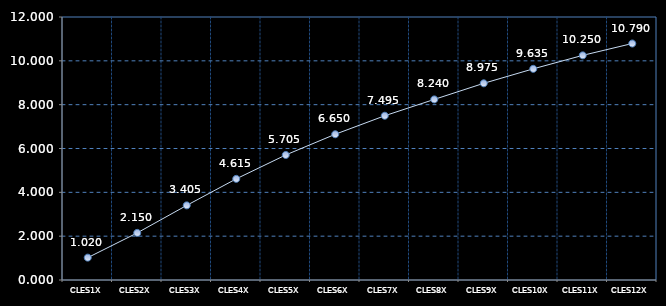
| Category | Series 0 |
|---|---|
| CLES1X | 1.02 |
| CLES2X | 2.15 |
| CLES3X | 3.405 |
| CLES4X | 4.615 |
| CLES5X | 5.705 |
| CLES6X | 6.65 |
| CLES7X | 7.495 |
| CLES8X | 8.24 |
| CLES9X | 8.975 |
| CLES10X | 9.635 |
| CLES11X | 10.25 |
| CLES12X | 10.79 |